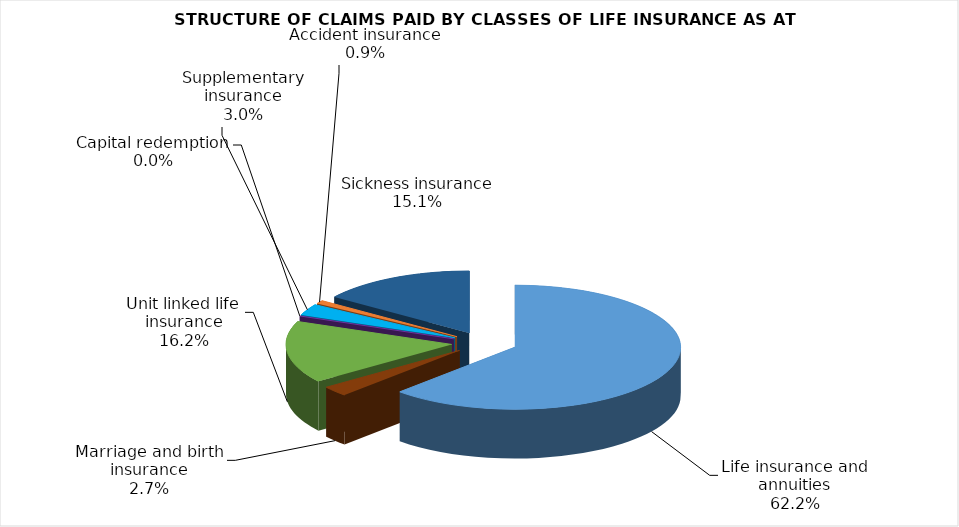
| Category | Life insurance and annuities |
|---|---|
| Life insurance and annuities | 146724664.794 |
| Marriage and birth insurance | 6266713.827 |
| Unit linked life insurance | 38094468.819 |
| Capital redemption | 0 |
| Supplementary insurance | 6980351.734 |
| Accident insurance | 2079604.71 |
| Sickness insurance | 35697281.104 |